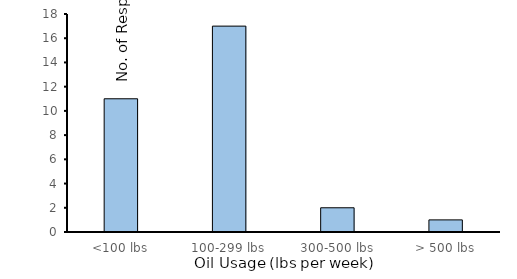
| Category | Series 0 |
|---|---|
| <100 lbs | 11 |
| 100-299 lbs | 17 |
| 300-500 lbs | 2 |
| > 500 lbs | 1 |